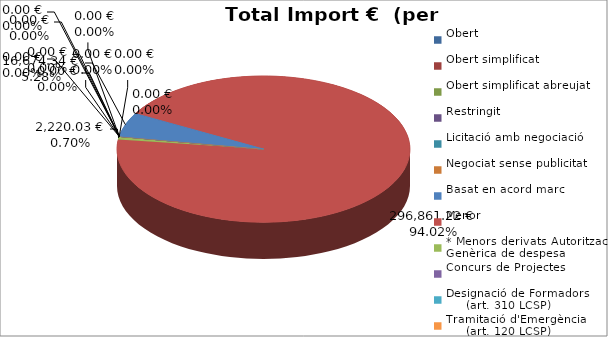
| Category | Total preu
(amb IVA) |
|---|---|
| Obert | 0 |
| Obert simplificat | 0 |
| Obert simplificat abreujat | 0 |
| Restringit | 0 |
| Licitació amb negociació | 0 |
| Negociat sense publicitat | 0 |
| Basat en acord marc | 16674.34 |
| Menor | 296861.22 |
| * Menors derivats Autorització Genèrica de despesa | 2220.03 |
| Concurs de Projectes | 0 |
| Designació de Formadors
     (art. 310 LCSP) | 0 |
| Tramitació d'Emergència
     (art. 120 LCSP) | 0 |